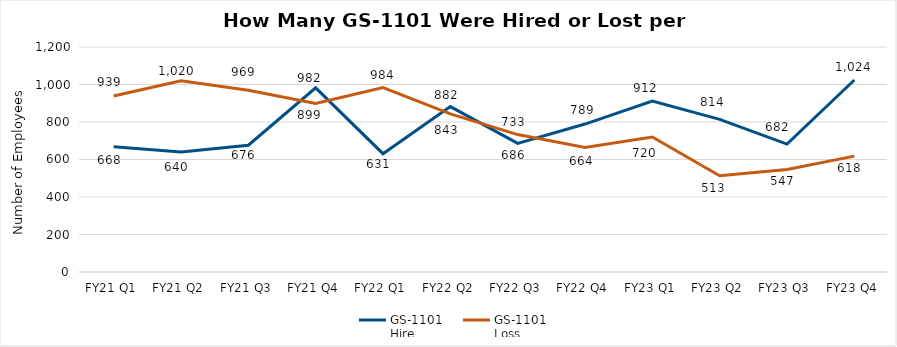
| Category | GS-1101 
Hire | GS-1101 
Loss |
|---|---|---|
| FY21 Q1 | 668 | 939 |
| FY21 Q2 | 640 | 1020 |
| FY21 Q3 | 676 | 969 |
| FY21 Q4 | 982 | 899 |
| FY22 Q1 | 631 | 984 |
| FY22 Q2 | 882 | 843 |
| FY22 Q3 | 686 | 733 |
| FY22 Q4 | 789 | 664 |
| FY23 Q1 | 912 | 720 |
| FY23 Q2 | 814 | 513 |
| FY23 Q3 | 682 | 547 |
| FY23 Q4 | 1024 | 618 |